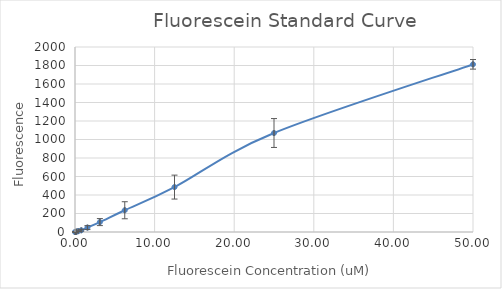
| Category | Series 0 |
|---|---|
| 50.0 | 1812.75 |
| 25.0 | 1070.05 |
| 12.5 | 485.5 |
| 6.25 | 235.175 |
| 3.125 | 107.065 |
| 1.5625 | 47.758 |
| 0.78125 | 18.738 |
| 0.390625 | 9.046 |
| 0.1953125 | 3.961 |
| 0.09765625 | 1.618 |
| 0.048828125 | 0.698 |
| 0.0 | 0.038 |